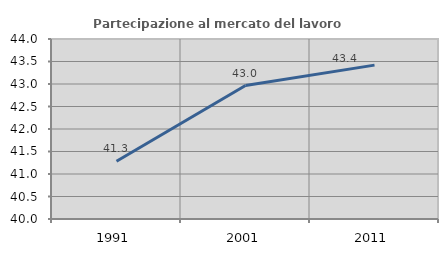
| Category | Partecipazione al mercato del lavoro  femminile |
|---|---|
| 1991.0 | 41.282 |
| 2001.0 | 42.966 |
| 2011.0 | 43.42 |